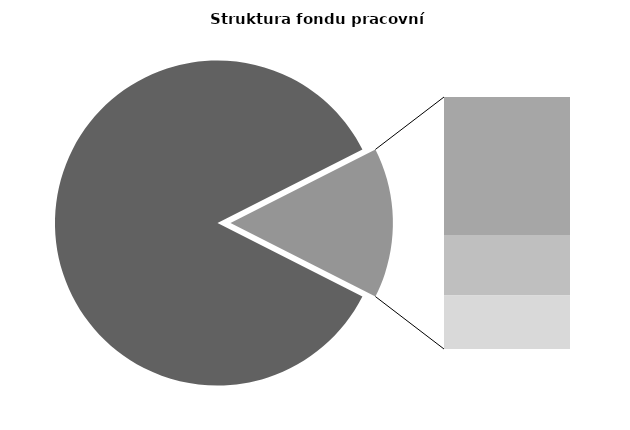
| Category | Series 0 |
|---|---|
| Průměrná měsíční odpracovaná doba bez přesčasu | 145.465 |
| Dovolená | 14.018 |
| Nemoc | 6.117 |
| Jiné | 5.44 |